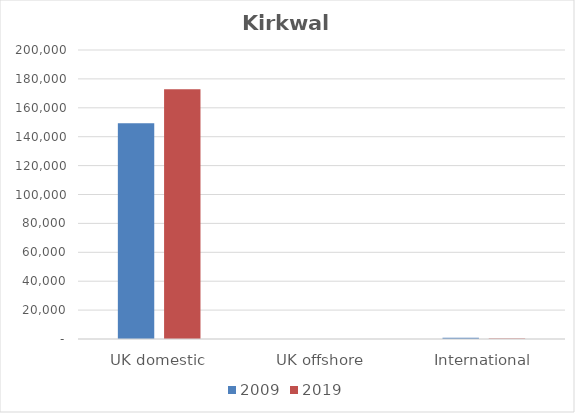
| Category | 2009 | 2019 |
|---|---|---|
| UK domestic | 149393 | 172755 |
| UK offshore | 7 | 34 |
| International | 885 | 355 |